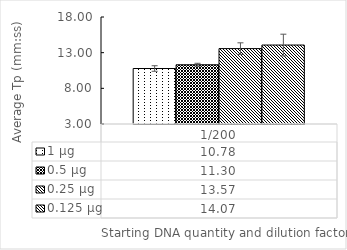
| Category | 1 µg | 0.5 µg | 0.25 µg | 0.125 µg |
|---|---|---|---|---|
| 1/200 | 10.78 | 11.3 | 13.57 | 14.07 |